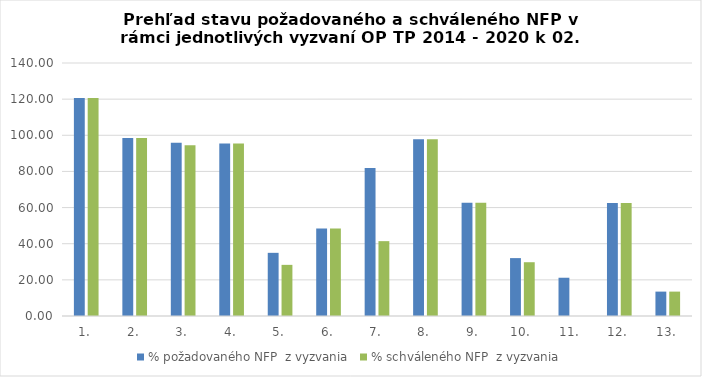
| Category | % požadovaného NFP  z vyzvania | % schváleného NFP  z vyzvania |
|---|---|---|
| 1. | 120.662 | 120.662 |
| 2. | 98.446 | 98.446 |
| 3. | 95.894 | 94.536 |
| 4. | 95.427 | 95.427 |
| 5. | 34.953 | 28.295 |
| 6. | 48.353 | 48.353 |
| 7. | 81.863 | 41.419 |
| 8. | 97.753 | 97.753 |
| 9. | 62.721 | 62.721 |
| 10. | 32.038 | 29.76 |
| 11. | 21.173 | 0 |
| 12. | 62.498 | 62.498 |
| 13. | 13.497 | 13.497 |